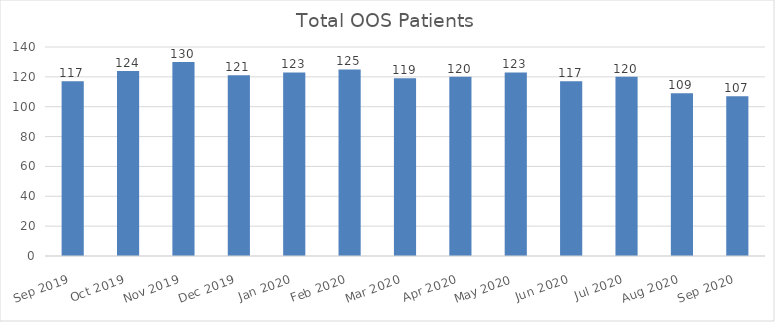
| Category | Series 0 |
|---|---|
| Sep 2019 | 117 |
| Oct 2019 | 124 |
| Nov 2019 | 130 |
| Dec 2019 | 121 |
| Jan 2020 | 123 |
| Feb 2020 | 125 |
| Mar 2020 | 119 |
| Apr 2020 | 120 |
| May 2020 | 123 |
| Jun 2020 | 117 |
| Jul 2020 | 120 |
| Aug 2020 | 109 |
| Sep 2020 | 107 |